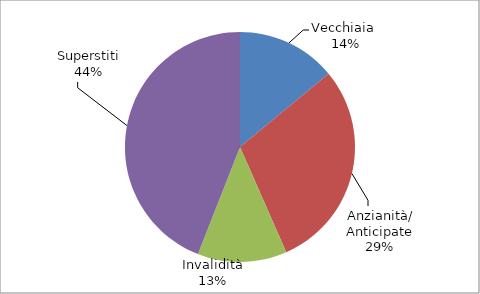
| Category | Series 0 |
|---|---|
| Vecchiaia  | 33559 |
| Anzianità/ Anticipate | 70560 |
| Invalidità | 30077 |
| Superstiti | 105629 |